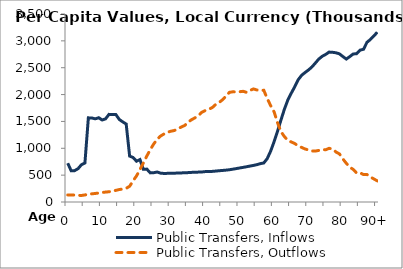
| Category | Public Transfers, Inflows | Public Transfers, Outflows |
|---|---|---|
| 0 | 722472.588 | 130961.843 |
|  | 581419.417 | 127980.716 |
| 2 | 583783.937 | 130342.25 |
| 3 | 620299.015 | 124047.477 |
| 4 | 695068.603 | 121643.219 |
| 5 | 725778.991 | 131457.111 |
| 6 | 1566526.945 | 143324.373 |
| 7 | 1564532.136 | 151696.167 |
| 8 | 1548147.568 | 159112.833 |
| 9 | 1569380.437 | 167691.538 |
| 10 | 1526965.76 | 177620.569 |
| 11 | 1547861.068 | 184686.355 |
| 12 | 1631186.077 | 191175.236 |
| 13 | 1627947.777 | 204299.142 |
| 14 | 1627885.271 | 216750.28 |
| 15 | 1536218.631 | 232222.888 |
| 16 | 1491173.285 | 241254.825 |
| 17 | 1451548.173 | 254733.72 |
| 18 | 854321.569 | 293033.345 |
| 19 | 828975.007 | 393276.56 |
| 20 | 759473.635 | 485578.662 |
| 21 | 789839.42 | 605164.482 |
| 22 | 608409.781 | 728280.095 |
| 23 | 612195.798 | 855808.305 |
| 24 | 542272.801 | 975117.553 |
| 25 | 545357.784 | 1080915.781 |
| 26 | 558098.321 | 1166317.68 |
| 27 | 537165.021 | 1227973.621 |
| 28 | 531289.355 | 1267071.081 |
| 29 | 533299.729 | 1298545.03 |
| 30 | 534985.261 | 1317935.459 |
| 31 | 536633.218 | 1331076.641 |
| 32 | 538892.298 | 1361369.116 |
| 33 | 541527.599 | 1395599.044 |
| 34 | 543959.282 | 1424747.398 |
| 35 | 546990.119 | 1485608.802 |
| 36 | 551364.4 | 1532151.067 |
| 37 | 553982.642 | 1566696.703 |
| 38 | 556445.665 | 1608681.763 |
| 39 | 558909.441 | 1671172.351 |
| 40 | 566031.521 | 1703261.087 |
| 41 | 567323.78 | 1727163.269 |
| 42 | 569688.259 | 1756571.825 |
| 43 | 575736.768 | 1814869.239 |
| 44 | 582168.397 | 1851789.418 |
| 45 | 587245.571 | 1903212.642 |
| 46 | 593324.02 | 1969614.575 |
| 47 | 600222.92 | 2041272.328 |
| 48 | 611244.673 | 2051715.11 |
| 49 | 621928.202 | 2048949.148 |
| 50 | 633784.575 | 2053586.936 |
| 51 | 644726.417 | 2060612.167 |
| 52 | 656192.695 | 2041153.81 |
| 53 | 668825.24 | 2077294.462 |
| 54 | 681476.521 | 2104872.168 |
| 55 | 694777.064 | 2085918.334 |
| 56 | 713917.336 | 2078776.535 |
| 57 | 726642.462 | 2080199.507 |
| 58 | 807504.017 | 1927509.98 |
| 59 | 947351.502 | 1793803.887 |
| 60 | 1122541.454 | 1677816.468 |
| 61 | 1317105.865 | 1477683.157 |
| 62 | 1527304.861 | 1308651.039 |
| 63 | 1728012.338 | 1218251.936 |
| 64 | 1899645.168 | 1143599.546 |
| 65 | 2026450.107 | 1118070.435 |
| 66 | 2144975.347 | 1089065.496 |
| 67 | 2275298.958 | 1044747.118 |
| 68 | 2358656.072 | 1016435.44 |
| 69 | 2409915.391 | 987169.078 |
| 70 | 2458155.108 | 969233.008 |
| 71 | 2514084.639 | 949015.458 |
| 72 | 2587029.199 | 948667.122 |
| 73 | 2661839.677 | 960169.792 |
| 74 | 2713004.907 | 975400.862 |
| 75 | 2747761.858 | 972802.959 |
| 76 | 2790955.9 | 999155.148 |
| 77 | 2786942.706 | 987025.624 |
| 78 | 2777938.83 | 929861.331 |
| 79 | 2758003.526 | 895811.911 |
| 80 | 2707493.178 | 801462.395 |
| 81 | 2661099.24 | 719987.092 |
| 82 | 2706706.167 | 647295.621 |
| 83 | 2755925.827 | 607268.41 |
| 84 | 2760662.843 | 538506.783 |
| 85 | 2827620.875 | 543452.96 |
| 86 | 2843146.52 | 511063.219 |
| 87 | 2972945.233 | 511801.141 |
| 88 | 3025614.611 | 466088.31 |
| 89 | 3092740.494 | 429494.291 |
| 90+ | 3159866.377 | 392900.273 |